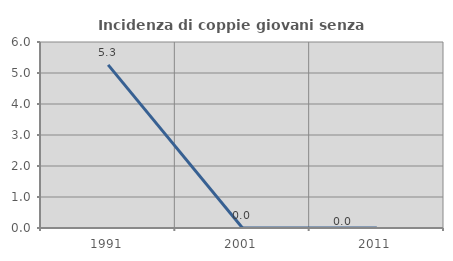
| Category | Incidenza di coppie giovani senza figli |
|---|---|
| 1991.0 | 5.263 |
| 2001.0 | 0 |
| 2011.0 | 0 |